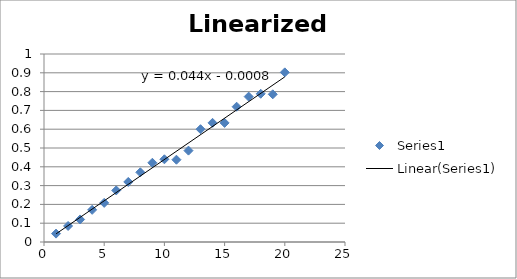
| Category | Series 0 |
|---|---|
| 1.0 | 0.045 |
| 2.0 | 0.085 |
| 3.0 | 0.12 |
| 4.0 | 0.171 |
| 5.0 | 0.208 |
| 6.0 | 0.274 |
| 7.0 | 0.319 |
| 8.0 | 0.371 |
| 9.0 | 0.421 |
| 10.0 | 0.44 |
| 11.0 | 0.438 |
| 12.0 | 0.486 |
| 13.0 | 0.6 |
| 14.0 | 0.634 |
| 15.0 | 0.633 |
| 16.0 | 0.72 |
| 17.0 | 0.773 |
| 18.0 | 0.788 |
| 19.0 | 0.786 |
| 20.0 | 0.902 |